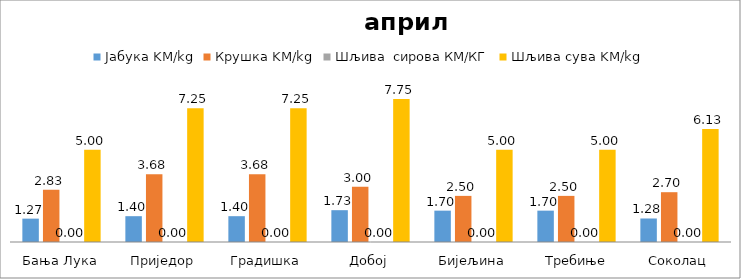
| Category | Јабука KM/kg | Крушка KM/kg | Шљива  сирова КМ/КГ | Шљива сува KM/kg |
|---|---|---|---|---|
| Бања Лука | 1.267 | 2.833 | 0 | 5 |
| Приједор | 1.4 | 3.675 | 0 | 7.25 |
| Градишка | 1.4 | 3.675 | 0 | 7.25 |
| Добој | 1.725 | 3 | 0 | 7.75 |
| Бијељина | 1.7 | 2.5 | 0 | 5 |
|  Требиње | 1.7 | 2.5 | 0 | 5 |
| Соколац | 1.275 | 2.7 | 0 | 6.125 |